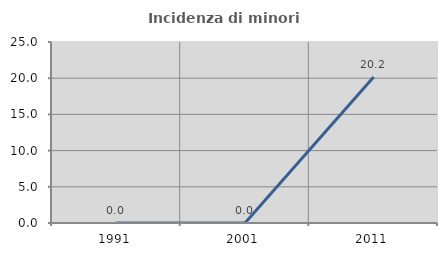
| Category | Incidenza di minori stranieri |
|---|---|
| 1991.0 | 0 |
| 2001.0 | 0 |
| 2011.0 | 20.175 |